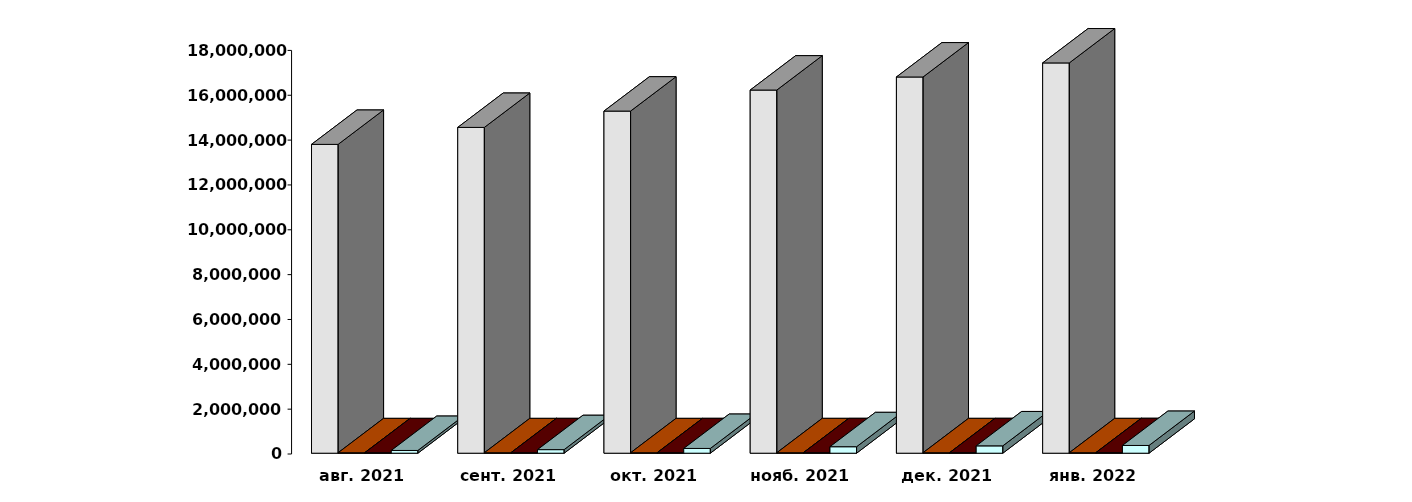
| Category | Физические лица | Юридические лица | Иностранные лица | Клиенты, передавшие свои средства в ДУ |
|---|---|---|---|---|
| 2021-08-30 | 13773190 | 19995 | 20283 | 122307 |
| 2021-09-30 | 14530193 | 20081 | 21060 | 158895 |
| 2021-10-30 | 15258509 | 20154 | 21894 | 212008 |
| 2021-11-30 | 16196130 | 20272 | 22719 | 288895 |
| 2021-12-31 | 16779069 | 20446 | 23517 | 327432 |
| 2022-01-31 | 17405817 | 20536 | 24147 | 345411 |